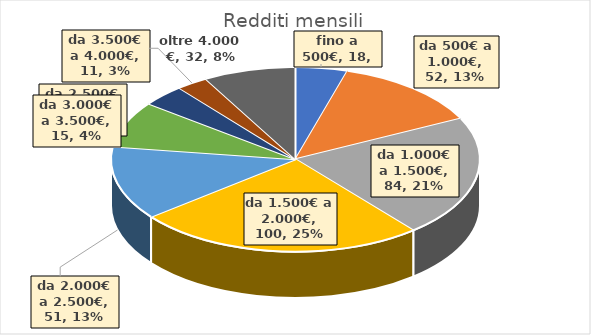
| Category | Series 0 |
|---|---|
| fino a 500€ | 18 |
| da 500€ a 1.000€ | 52 |
| da 1.000€ a 1.500€ | 84 |
| da 1.500€ a 2.000€ | 100 |
| da 2.000€ a 2.500€ | 51 |
| da 2.500€ a 3.000€ | 32 |
| da 3.000€ a 3.500€ | 15 |
| da 3.500€ a 4.000€ | 11 |
| oltre 4.000 € | 32 |